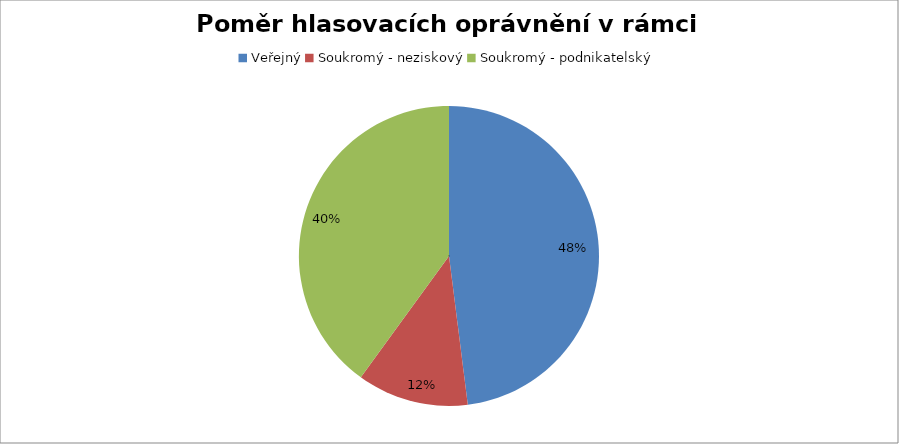
| Category | Series 0 |
|---|---|
| Veřejný | 0.48 |
| Soukromý - neziskový | 0.12 |
| Soukromý - podnikatelský | 0.4 |